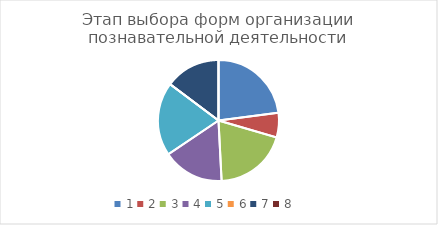
| Category | Series 0 |
|---|---|
| 0 | 0.275 |
| 1 | 0.078 |
| 2 | 0.235 |
| 3 | 0.196 |
| 4 | 0.235 |
| 5 | 0 |
| 6 | 0.176 |
| 7 | 0 |